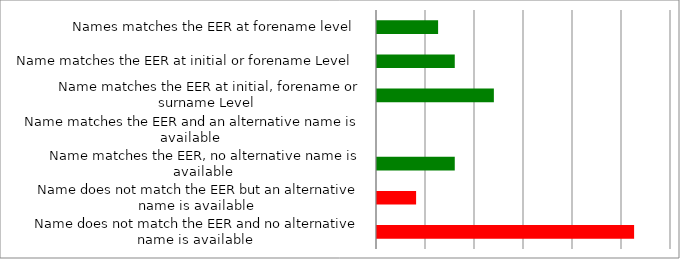
| Category | Series 0 |
|---|---|
|  Names matches the EER at forename level  | 12471 |
|  Name matches the EER at initial or forename Level  | 15870 |
|  Name matches the EER at initial, forename or surname Level  | 23850 |
|  Name matches the EER and an alternative name is available  | 0 |
|  Name matches the EER, no alternative name is available  | 15870 |
|  Name does not match the EER but an alternative name is available  | 7980 |
|  Name does not match the EER and no alternative name is available  | 52470 |